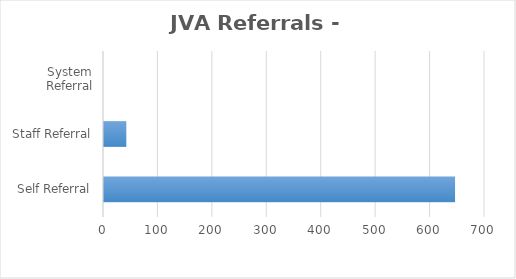
| Category | Series 0 |
|---|---|
| Self Referral | 645 |
| Staff Referral | 41 |
| System Referral | 0 |